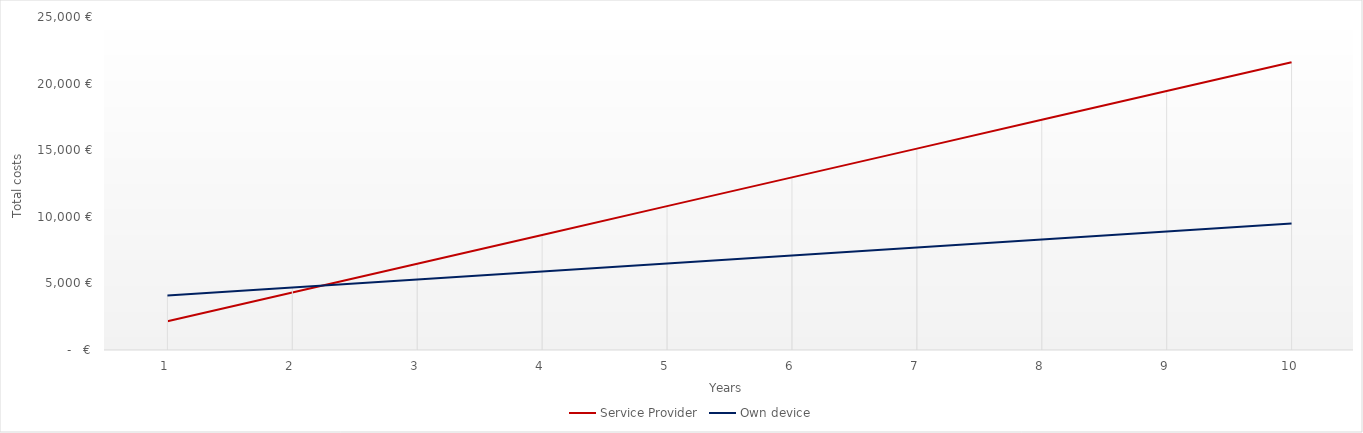
| Category | Service Provider | Own device |
|---|---|---|
| 0 | 2160 | 4100 |
| 1 | 4320 | 4700 |
| 2 | 6480 | 5300 |
| 3 | 8640 | 5900 |
| 4 | 10800 | 6500 |
| 5 | 12960 | 7100 |
| 6 | 15120 | 7700 |
| 7 | 17280 | 8300 |
| 8 | 19440 | 8900 |
| 9 | 21600 | 9500 |